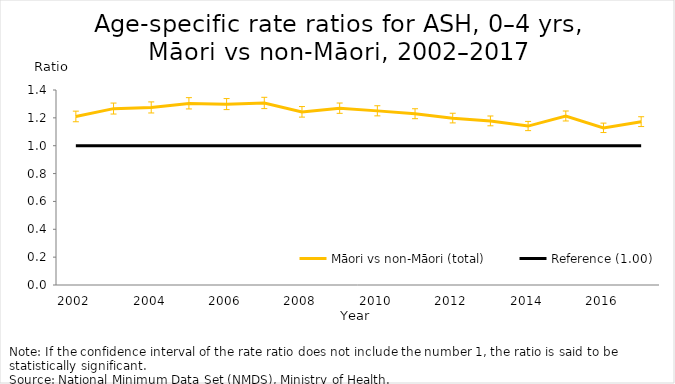
| Category | Māori vs non-Māori (total) | Reference (1.00) |
|---|---|---|
| 2002.0 | 1.209 | 1 |
| 2003.0 | 1.266 | 1 |
| 2004.0 | 1.274 | 1 |
| 2005.0 | 1.304 | 1 |
| 2006.0 | 1.298 | 1 |
| 2007.0 | 1.306 | 1 |
| 2008.0 | 1.243 | 1 |
| 2009.0 | 1.269 | 1 |
| 2010.0 | 1.25 | 1 |
| 2011.0 | 1.229 | 1 |
| 2012.0 | 1.198 | 1 |
| 2013.0 | 1.178 | 1 |
| 2014.0 | 1.141 | 1 |
| 2015.0 | 1.213 | 1 |
| 2016.0 | 1.128 | 1 |
| 2017.0 | 1.172 | 1 |